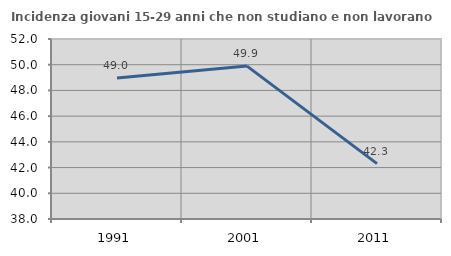
| Category | Incidenza giovani 15-29 anni che non studiano e non lavorano  |
|---|---|
| 1991.0 | 48.964 |
| 2001.0 | 49.894 |
| 2011.0 | 42.304 |